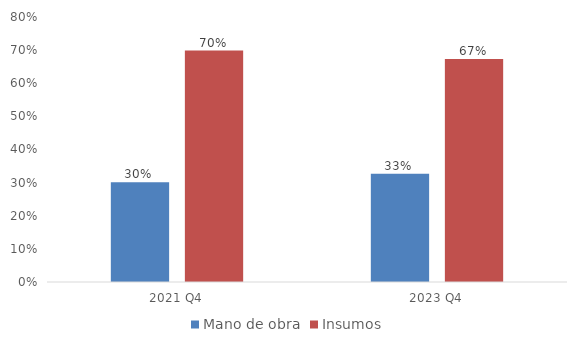
| Category | Mano de obra | Insumos |
|---|---|---|
| 2021 Q4 | 0.301 | 0.699 |
| 2023 Q4 | 0.327 | 0.673 |